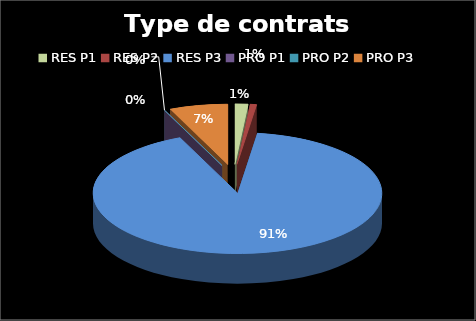
| Category | Series 0 |
|---|---|
| RES P1 | 2 |
| RES P2 | 1 |
| RES P3 | 126 |
| PRO P1 | 0 |
| PRO P2 | 0 |
| PRO P3 | 9 |